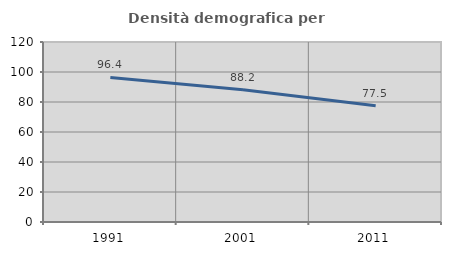
| Category | Densità demografica |
|---|---|
| 1991.0 | 96.394 |
| 2001.0 | 88.222 |
| 2011.0 | 77.504 |